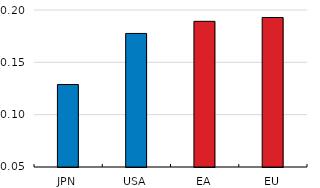
| Category | STRI 2022 |
|---|---|
| JPN | 0.129 |
| USA | 0.178 |
| EA | 0.189 |
| EU | 0.193 |